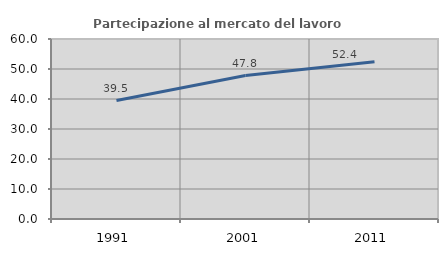
| Category | Partecipazione al mercato del lavoro  femminile |
|---|---|
| 1991.0 | 39.492 |
| 2001.0 | 47.833 |
| 2011.0 | 52.416 |